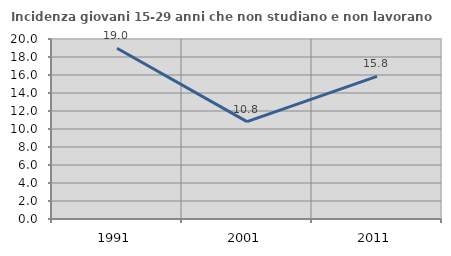
| Category | Incidenza giovani 15-29 anni che non studiano e non lavorano  |
|---|---|
| 1991.0 | 18.972 |
| 2001.0 | 10.82 |
| 2011.0 | 15.849 |